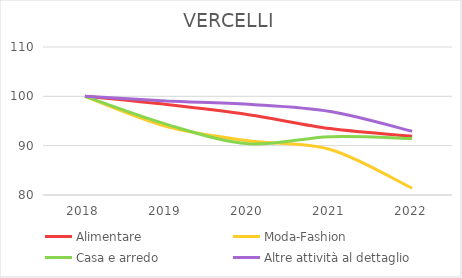
| Category | Alimentare | Moda-Fashion | Casa e arredo | Altre attività al dettaglio |
|---|---|---|---|---|
| 2018.0 | 100 | 100 | 100 | 100 |
| 2019.0 | 98.333 | 93.886 | 94.306 | 99.078 |
| 2020.0 | 96.282 | 90.975 | 90.391 | 98.386 |
| 2021.0 | 93.462 | 89.229 | 91.815 | 96.925 |
| 2022.0 | 91.923 | 81.368 | 91.459 | 92.929 |